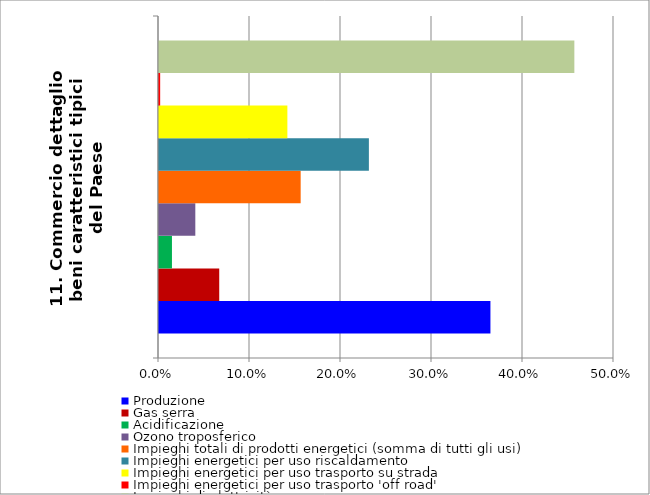
| Category | Produzione | Gas serra | Acidificazione | Ozono troposferico | Impieghi totali di prodotti energetici (somma di tutti gli usi) | Impieghi energetici per uso riscaldamento | Impieghi energetici per uso trasporto su strada | Impieghi energetici per uso trasporto 'off road' | Impieghi di elettricità |
|---|---|---|---|---|---|---|---|---|---|
| 11. Commercio dettaglio beni caratteristici tipici del Paese | 0.364 | 0.066 | 0.014 | 0.04 | 0.156 | 0.231 | 0.141 | 0.001 | 0.456 |